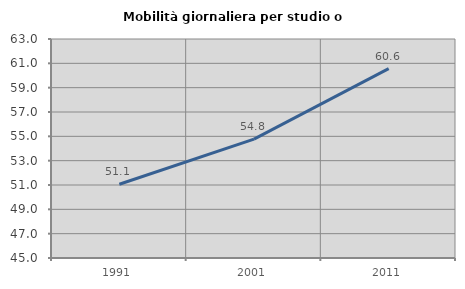
| Category | Mobilità giornaliera per studio o lavoro |
|---|---|
| 1991.0 | 51.059 |
| 2001.0 | 54.764 |
| 2011.0 | 60.56 |